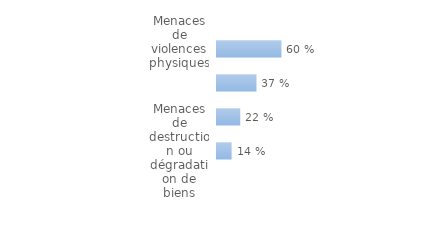
| Category | Series 0 |
|---|---|
| Menaces de destruction ou dégradation de biens | 0.136 |
| Menaces pour contraindre à faire ou ne pas faire quelque chose | 0.217 |
| Menaces de dire ou faire quelque chose qui puisse causer du tort | 0.369 |
| Menaces de violences physiques | 0.602 |